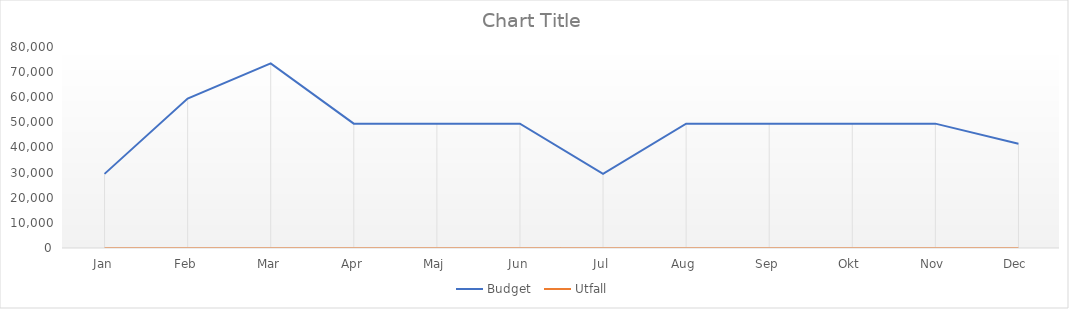
| Category | Budget  | Utfall |
|---|---|---|
| Jan | 29500 | 0 |
| Feb | 59500 | 0 |
| Mar | 73500 | 0 |
| Apr | 49500 | 0 |
| Maj | 49500 | 0 |
| Jun | 49500 | 0 |
| Jul | 29500 | 0 |
| Aug | 49500 | 0 |
| Sep | 49500 | 0 |
| Okt | 49500 | 0 |
| Nov | 49500 | 0 |
| Dec | 41500 | 0 |